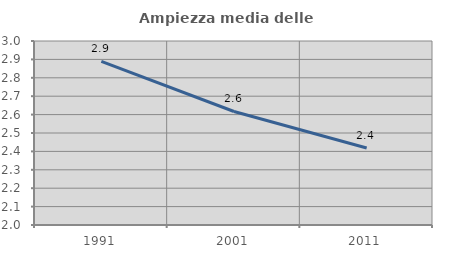
| Category | Ampiezza media delle famiglie |
|---|---|
| 1991.0 | 2.889 |
| 2001.0 | 2.617 |
| 2011.0 | 2.419 |